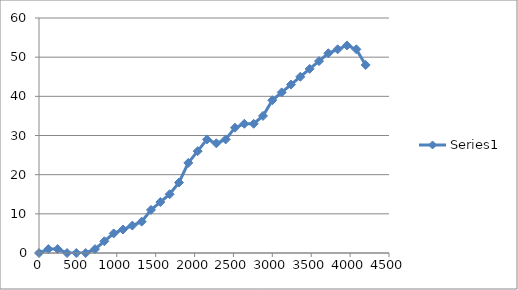
| Category | Series 0 |
|---|---|
| 0.0 | 0 |
| 120.0 | 1 |
| 240.0 | 1 |
| 360.0 | 0 |
| 480.0 | 0 |
| 600.0 | 0 |
| 720.0 | 1 |
| 840.0 | 3 |
| 960.0 | 5 |
| 1080.0 | 6 |
| 1200.0 | 7 |
| 1320.0 | 8 |
| 1440.0 | 11 |
| 1560.0 | 13 |
| 1680.0 | 15 |
| 1800.0 | 18 |
| 1920.0 | 23 |
| 2040.0 | 26 |
| 2160.0 | 29 |
| 2280.0 | 28 |
| 2400.0 | 29 |
| 2520.0 | 32 |
| 2640.0 | 33 |
| 2760.0 | 33 |
| 2880.0 | 35 |
| 3000.0 | 39 |
| 3120.0 | 41 |
| 3240.0 | 43 |
| 3360.0 | 45 |
| 3480.0 | 47 |
| 3600.0 | 49 |
| 3720.0 | 51 |
| 3840.0 | 52 |
| 3960.0 | 53 |
| 4080.0 | 52 |
| 4200.0 | 48 |